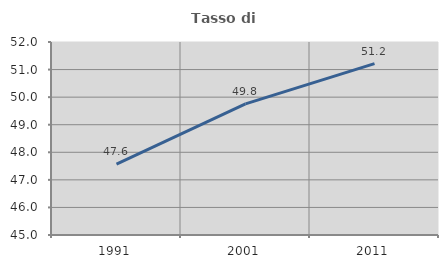
| Category | Tasso di occupazione   |
|---|---|
| 1991.0 | 47.57 |
| 2001.0 | 49.754 |
| 2011.0 | 51.218 |